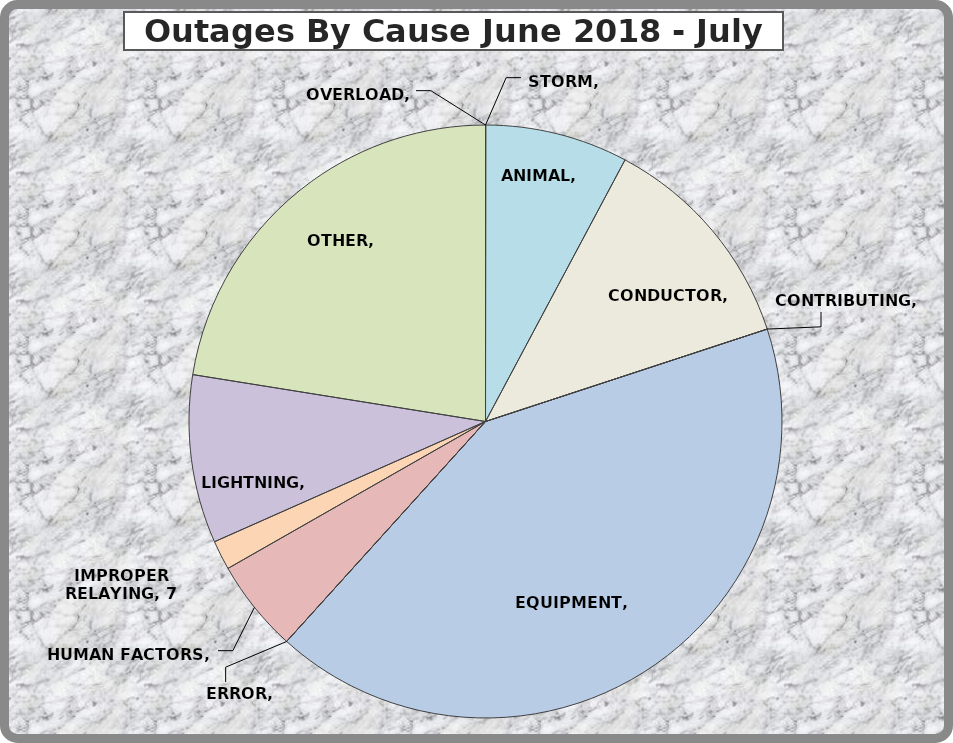
| Category | Series 0 |
|---|---|
| ANIMAL | 34 |
| CONDUCTOR | 53 |
| CONTRIBUTING | 0 |
| EQUIPMENT | 182 |
| ERROR | 0 |
| HUMAN FACTORS | 22 |
| IMPROPER RELAYING | 7 |
| LIGHTNING | 40 |
| OTHER | 98 |
| OVERLOAD | 0 |
| STORM | 0 |